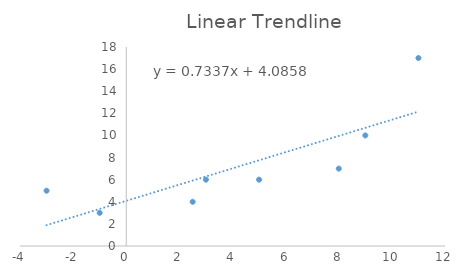
| Category | Series 0 |
|---|---|
| -3.0 | 5 |
| -1.0 | 3 |
| 2.5 | 4 |
| 3.0 | 6 |
| 5.0 | 6 |
| 8.0 | 7 |
| 9.0 | 10 |
| 11.0 | 17 |